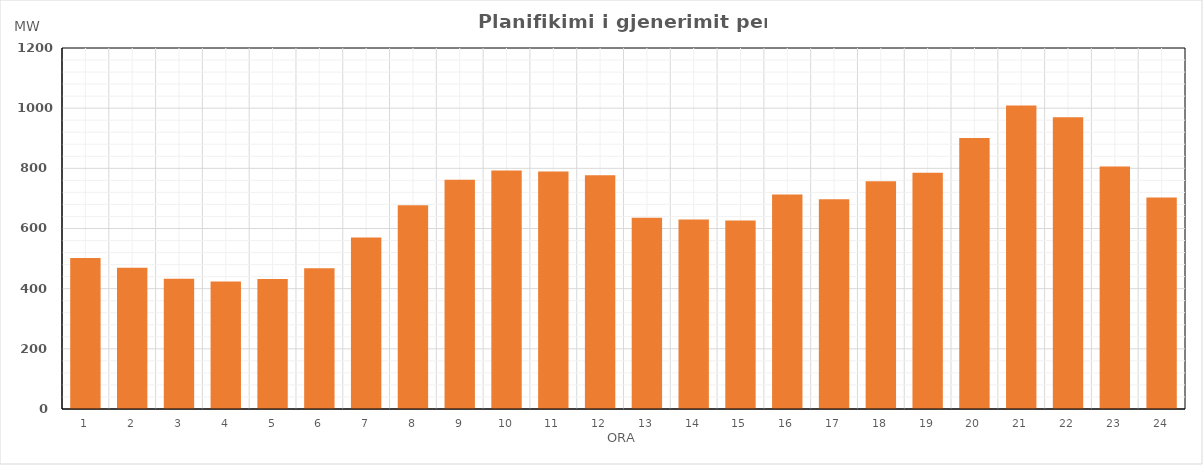
| Category | Max (MW) |
|---|---|
| 0 | 502.18 |
| 1 | 469.44 |
| 2 | 432.84 |
| 3 | 423.54 |
| 4 | 431.94 |
| 5 | 468.11 |
| 6 | 570.16 |
| 7 | 677.13 |
| 8 | 761.78 |
| 9 | 793.15 |
| 10 | 789.7 |
| 11 | 777.23 |
| 12 | 635.35 |
| 13 | 629.95 |
| 14 | 626.36 |
| 15 | 713.12 |
| 16 | 697.05 |
| 17 | 756.85 |
| 18 | 785.26 |
| 19 | 900.98 |
| 20 | 1008.85 |
| 21 | 969.98 |
| 22 | 805.99 |
| 23 | 702.79 |